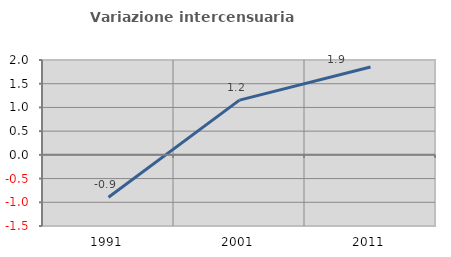
| Category | Variazione intercensuaria annua |
|---|---|
| 1991.0 | -0.893 |
| 2001.0 | 1.154 |
| 2011.0 | 1.854 |